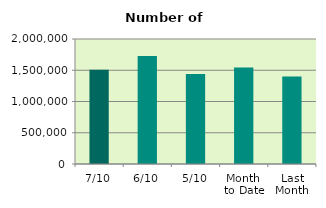
| Category | Series 0 |
|---|---|
| 7/10 | 1509330 |
| 6/10 | 1727234 |
| 5/10 | 1438950 |
| Month 
to Date | 1542871.6 |
| Last
Month | 1399299.909 |